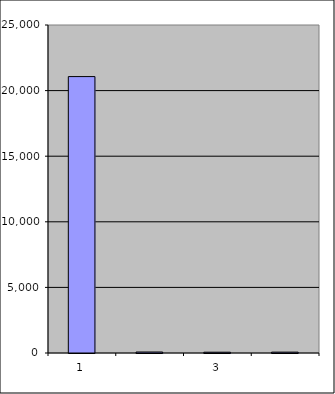
| Category | Series 0 |
|---|---|
| 0 | 21068.5 |
| 1 | 76.126 |
| 2 | 60.201 |
| 3 | 65.57 |